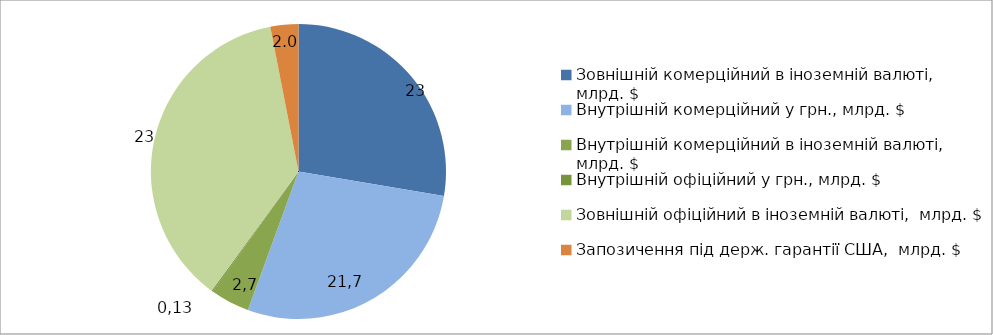
| Category | Series 0 |
|---|---|
| Зовнішній комерційний в іноземній валюті,  млрд. $ | 18.05 |
| Внутрішній комерційний у грн., млрд. $ | 18.206 |
| Внутрішній комерційний в іноземній валюті,  млрд. $ | 2.803 |
| Внутрішній офіційний у грн., млрд. $ | 0.1 |
| Зовнішній офіційний в іноземній валюті,  млрд. $ | 24.079 |
| Запозичення під держ. гарантії США,  млрд. $ | 2 |